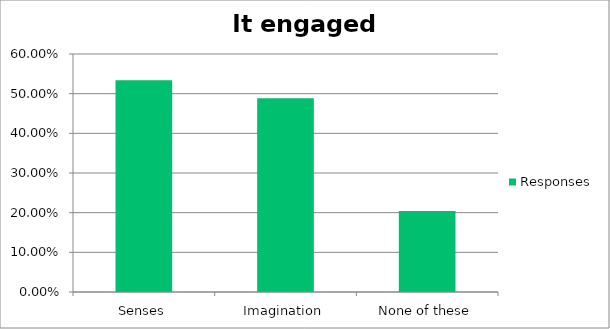
| Category | Responses |
|---|---|
| Senses | 0.534 |
| Imagination | 0.489 |
| None of these | 0.204 |